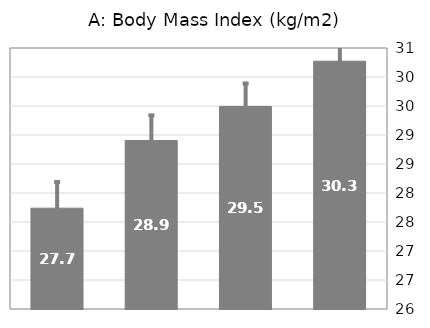
| Category | Series 0 |
|---|---|
| not bitter sensitive ate bitter vegs | 27.739 |
| bitter sensitive ate bitter vegs | 28.905 |
| not bitter sensitive not ate bitter vegs | 29.492 |
| bitter sensitive not ate bitter vegs | 30.272 |